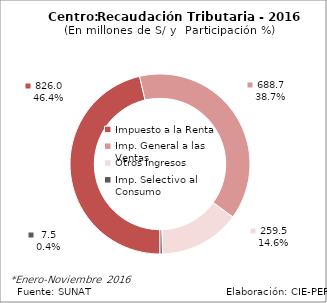
| Category | 2016 |
|---|---|
| Impuesto a la Renta | 825.984 |
| Imp. General a las Ventas | 688.652 |
| Otros Ingresos | 259.54 |
| Imp. Selectivo al Consumo | 7.535 |